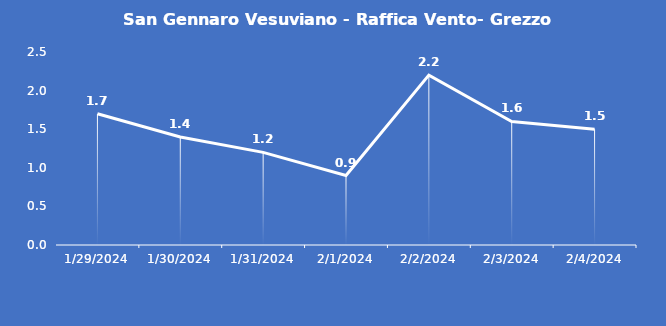
| Category | San Gennaro Vesuviano - Raffica Vento- Grezzo (m/s) |
|---|---|
| 1/29/24 | 1.7 |
| 1/30/24 | 1.4 |
| 1/31/24 | 1.2 |
| 2/1/24 | 0.9 |
| 2/2/24 | 2.2 |
| 2/3/24 | 1.6 |
| 2/4/24 | 1.5 |